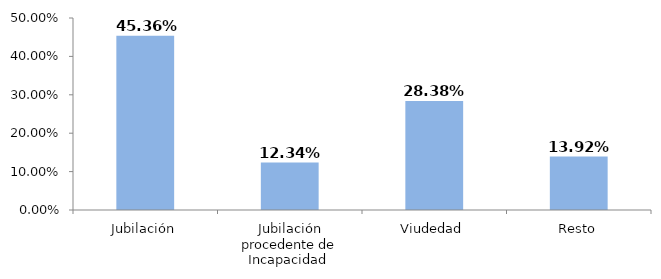
| Category | Series 0 |
|---|---|
| Jubilación | 0.454 |
| Jubilación procedente de Incapacidad  | 0.123 |
| Viudedad | 0.284 |
| Resto | 0.139 |